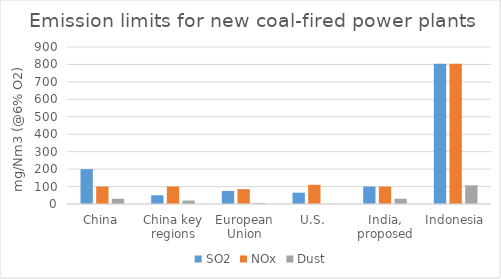
| Category | SO2 | NOx | Dust |
|---|---|---|---|
| China | 200 | 100 | 30 |
| China key regions | 50 | 100 | 20 |
| European Union | 75 | 85 | 5 |
| U.S. | 65 | 110 | 1 |
| India, proposed | 100 | 100 | 30 |
| Indonesia | 803.571 | 803.571 | 107.143 |